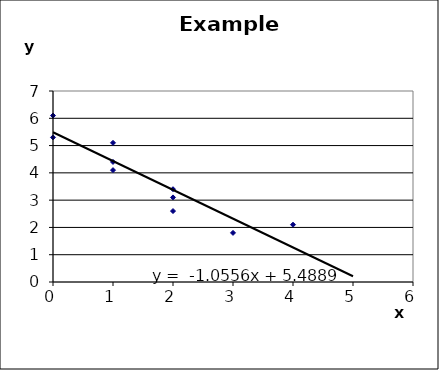
| Category | Series 0 |
|---|---|
| 0.0 | 6.1 |
| 0.0 | 5.3 |
| 1.0 | 4.1 |
| 1.0 | 5.1 |
| 1.0 | 4.4 |
| 2.0 | 3.4 |
| 2.0 | 2.6 |
| 2.0 | 3.1 |
| 3.0 | 1.8 |
| 4.0 | 2.1 |